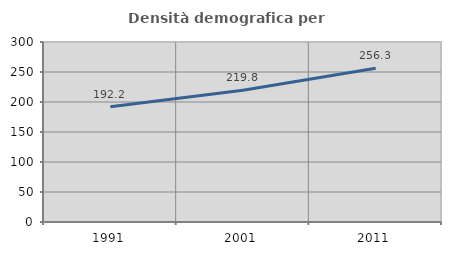
| Category | Densità demografica |
|---|---|
| 1991.0 | 192.162 |
| 2001.0 | 219.754 |
| 2011.0 | 256.257 |